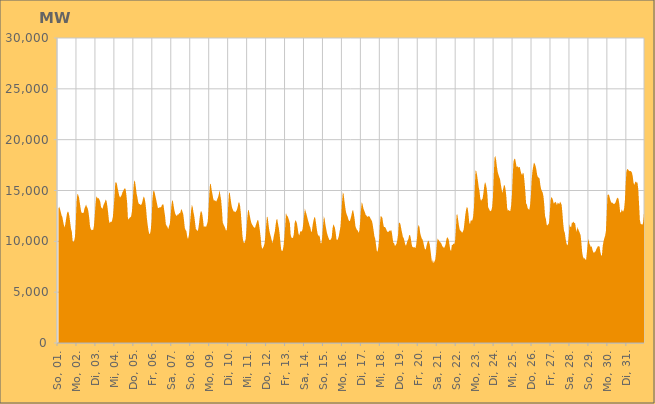
| Category | Series 0 |
|---|---|
|  So, 01.  | 13206.812 |
|  So, 01.  | 13412.942 |
|  So, 01.  | 13187.907 |
|  So, 01.  | 12871.879 |
|  So, 01.  | 12567.019 |
|  So, 01.  | 12397.906 |
|  So, 01.  | 11959.131 |
|  So, 01.  | 11577.426 |
|  So, 01.  | 11364.765 |
|  So, 01.  | 11830.467 |
|  So, 01.  | 12331.606 |
|  So, 01.  | 12767.486 |
|  So, 01.  | 12943.968 |
|  So, 01.  | 12820.488 |
|  So, 01.  | 12429.782 |
|  So, 01.  | 11808.548 |
|  So, 01.  | 11217.723 |
|  Mo, 02.  | 10958.293 |
|  Mo, 02.  | 10046.85 |
|  Mo, 02.  | 9942.97 |
|  Mo, 02.  | 10063.254 |
|  Mo, 02.  | 10441.677 |
|  Mo, 02.  | 11829.314 |
|  Mo, 02.  | 13896.691 |
|  Mo, 02.  | 14652.686 |
|  Mo, 02.  | 14580.764 |
|  Mo, 02.  | 14350.04 |
|  Mo, 02.  | 13843.688 |
|  Mo, 02.  | 13322.694 |
|  Mo, 02.  | 12867.822 |
|  Mo, 02.  | 12779.872 |
|  Mo, 02.  | 12807.514 |
|  Mo, 02.  | 12804.091 |
|  Mo, 02.  | 13235.563 |
|  Mo, 02.  | 13409.297 |
|  Mo, 02.  | 13611.059 |
|  Mo, 02.  | 13400.346 |
|  Mo, 02.  | 13248.885 |
|  Mo, 02.  | 12930.047 |
|  Mo, 02.  | 12322.647 |
|  Mo, 02.  | 11476.606 |
|  Di, 03.  | 11216.047 |
|  Di, 03.  | 11098.079 |
|  Di, 03.  | 11136.207 |
|  Di, 03.  | 11114.453 |
|  Di, 03.  | 11530.686 |
|  Di, 03.  | 12478.214 |
|  Di, 03.  | 13642.537 |
|  Di, 03.  | 14421.271 |
|  Di, 03.  | 14324.255 |
|  Di, 03.  | 14206.972 |
|  Di, 03.  | 14263.212 |
|  Di, 03.  | 14076.895 |
|  Di, 03.  | 13895.04 |
|  Di, 03.  | 13350.521 |
|  Di, 03.  | 13271.455 |
|  Di, 03.  | 13212.365 |
|  Di, 03.  | 13554.942 |
|  Di, 03.  | 13724.392 |
|  Di, 03.  | 13900.76 |
|  Di, 03.  | 14119.902 |
|  Di, 03.  | 13956.413 |
|  Di, 03.  | 13445.582 |
|  Di, 03.  | 12805.064 |
|  Di, 03.  | 12042.712 |
|  Mi, 04.  | 11762.654 |
|  Mi, 04.  | 11934.412 |
|  Mi, 04.  | 11892.97 |
|  Mi, 04.  | 12057.988 |
|  Mi, 04.  | 12428.07 |
|  Mi, 04.  | 13312.577 |
|  Mi, 04.  | 14398.44 |
|  Mi, 04.  | 15741.246 |
|  Mi, 04.  | 15831.863 |
|  Mi, 04.  | 15671.158 |
|  Mi, 04.  | 15222.06 |
|  Mi, 04.  | 14851.032 |
|  Mi, 04.  | 14500.277 |
|  Mi, 04.  | 14307.952 |
|  Mi, 04.  | 14420.647 |
|  Mi, 04.  | 14538.542 |
|  Mi, 04.  | 14801.566 |
|  Mi, 04.  | 14943.229 |
|  Mi, 04.  | 15120.116 |
|  Mi, 04.  | 15221.407 |
|  Mi, 04.  | 15163.406 |
|  Mi, 04.  | 14598.801 |
|  Mi, 04.  | 13806.711 |
|  Mi, 04.  | 12297.38 |
|  Do, 05.  | 12141.491 |
|  Do, 05.  | 12313.181 |
|  Do, 05.  | 12368.373 |
|  Do, 05.  | 12440.057 |
|  Do, 05.  | 12898.041 |
|  Do, 05.  | 13760.099 |
|  Do, 05.  | 15183.152 |
|  Do, 05.  | 16004.259 |
|  Do, 05.  | 15871.261 |
|  Do, 05.  | 15353.351 |
|  Do, 05.  | 14699.198 |
|  Do, 05.  | 14322.082 |
|  Do, 05.  | 13863.061 |
|  Do, 05.  | 13665.603 |
|  Do, 05.  | 13670.417 |
|  Do, 05.  | 13579.349 |
|  Do, 05.  | 13604.6 |
|  Do, 05.  | 13816.485 |
|  Do, 05.  | 14157.835 |
|  Do, 05.  | 14406.164 |
|  Do, 05.  | 14275.221 |
|  Do, 05.  | 13863.005 |
|  Do, 05.  | 13214.484 |
|  Do, 05.  | 12266.777 |
|  Fr, 06.  | 11625.596 |
|  Fr, 06.  | 11079.019 |
|  Fr, 06.  | 10730.204 |
|  Fr, 06.  | 10743.185 |
|  Fr, 06.  | 11172.749 |
|  Fr, 06.  | 12118.175 |
|  Fr, 06.  | 14074.129 |
|  Fr, 06.  | 14894.658 |
|  Fr, 06.  | 15016.659 |
|  Fr, 06.  | 14746.179 |
|  Fr, 06.  | 14354.104 |
|  Fr, 06.  | 14027.11 |
|  Fr, 06.  | 13626.706 |
|  Fr, 06.  | 13277.289 |
|  Fr, 06.  | 13278.358 |
|  Fr, 06.  | 13347.249 |
|  Fr, 06.  | 13361.531 |
|  Fr, 06.  | 13365.29 |
|  Fr, 06.  | 13548.451 |
|  Fr, 06.  | 13647.924 |
|  Fr, 06.  | 13613.515 |
|  Fr, 06.  | 13014.601 |
|  Fr, 06.  | 12491.047 |
|  Fr, 06.  | 11682.633 |
|  Sa, 07.  | 11520.466 |
|  Sa, 07.  | 11438.673 |
|  Sa, 07.  | 11185.14 |
|  Sa, 07.  | 11484.688 |
|  Sa, 07.  | 11713.624 |
|  Sa, 07.  | 12400.79 |
|  Sa, 07.  | 13446.049 |
|  Sa, 07.  | 14038.288 |
|  Sa, 07.  | 13945.266 |
|  Sa, 07.  | 13421.592 |
|  Sa, 07.  | 12986.292 |
|  Sa, 07.  | 12685.922 |
|  Sa, 07.  | 12546.355 |
|  Sa, 07.  | 12504.76 |
|  Sa, 07.  | 12655.341 |
|  Sa, 07.  | 12642.896 |
|  Sa, 07.  | 12801.196 |
|  Sa, 07.  | 12738.394 |
|  Sa, 07.  | 13021.284 |
|  Sa, 07.  | 13174.04 |
|  Sa, 07.  | 12913.663 |
|  Sa, 07.  | 12684.267 |
|  Sa, 07.  | 12057.798 |
|  Sa, 07.  | 11311.35 |
|  So, 08.  | 11118.741 |
|  So, 08.  | 11001.714 |
|  So, 08.  | 10464.286 |
|  So, 08.  | 10224.884 |
|  So, 08.  | 10521.399 |
|  So, 08.  | 11080.018 |
|  So, 08.  | 12144.926 |
|  So, 08.  | 13048.655 |
|  So, 08.  | 13595.226 |
|  So, 08.  | 13363.08 |
|  So, 08.  | 12842.564 |
|  So, 08.  | 12481.511 |
|  So, 08.  | 11842.349 |
|  So, 08.  | 11212.838 |
|  So, 08.  | 11140.497 |
|  So, 08.  | 10992.239 |
|  So, 08.  | 11195.822 |
|  So, 08.  | 11716.869 |
|  So, 08.  | 12424.722 |
|  So, 08.  | 12913.138 |
|  So, 08.  | 12971.084 |
|  So, 08.  | 12720.39 |
|  So, 08.  | 12166.647 |
|  So, 08.  | 11444.404 |
|  Mo, 09.  | 11458.213 |
|  Mo, 09.  | 11462.394 |
|  Mo, 09.  | 11429.864 |
|  Mo, 09.  | 11656.963 |
|  Mo, 09.  | 11947.008 |
|  Mo, 09.  | 13042.342 |
|  Mo, 09.  | 14641.893 |
|  Mo, 09.  | 15672.245 |
|  Mo, 09.  | 15595.711 |
|  Mo, 09.  | 15038.386 |
|  Mo, 09.  | 14645.687 |
|  Mo, 09.  | 14189.676 |
|  Mo, 09.  | 13979.174 |
|  Mo, 09.  | 14067.064 |
|  Mo, 09.  | 13956.225 |
|  Mo, 09.  | 13928.717 |
|  Mo, 09.  | 14140.428 |
|  Mo, 09.  | 14317.686 |
|  Mo, 09.  | 14609.709 |
|  Mo, 09.  | 15028.047 |
|  Mo, 09.  | 14518.894 |
|  Mo, 09.  | 14045.839 |
|  Mo, 09.  | 13153.1 |
|  Mo, 09.  | 11882.105 |
|  Di, 10.  | 11658.072 |
|  Di, 10.  | 11512.674 |
|  Di, 10.  | 11330.217 |
|  Di, 10.  | 11090.632 |
|  Di, 10.  | 11085.22 |
|  Di, 10.  | 11880.764 |
|  Di, 10.  | 13671.089 |
|  Di, 10.  | 14817.556 |
|  Di, 10.  | 14725.402 |
|  Di, 10.  | 14172.264 |
|  Di, 10.  | 13623.232 |
|  Di, 10.  | 13265.014 |
|  Di, 10.  | 13088.367 |
|  Di, 10.  | 12941.091 |
|  Di, 10.  | 12948.157 |
|  Di, 10.  | 12864.173 |
|  Di, 10.  | 12976.701 |
|  Di, 10.  | 13114.904 |
|  Di, 10.  | 13404.971 |
|  Di, 10.  | 13826.029 |
|  Di, 10.  | 13829.934 |
|  Di, 10.  | 13467.711 |
|  Di, 10.  | 12725.259 |
|  Di, 10.  | 11647.776 |
|  Mi, 11.  | 10518.37 |
|  Mi, 11.  | 10001.466 |
|  Mi, 11.  | 9835.466 |
|  Mi, 11.  | 9913.186 |
|  Mi, 11.  | 10233.437 |
|  Mi, 11.  | 11029.984 |
|  Mi, 11.  | 12198.503 |
|  Mi, 11.  | 12996.611 |
|  Mi, 11.  | 13099.688 |
|  Mi, 11.  | 12617.356 |
|  Mi, 11.  | 12215.195 |
|  Mi, 11.  | 11868.638 |
|  Mi, 11.  | 11674.581 |
|  Mi, 11.  | 11559.054 |
|  Mi, 11.  | 11419.342 |
|  Mi, 11.  | 11348.374 |
|  Mi, 11.  | 11344.958 |
|  Mi, 11.  | 11627.68 |
|  Mi, 11.  | 11844.355 |
|  Mi, 11.  | 12090.624 |
|  Mi, 11.  | 12075.187 |
|  Mi, 11.  | 11619.831 |
|  Mi, 11.  | 11073.065 |
|  Mi, 11.  | 10401.215 |
|  Do, 12.  | 9569.502 |
|  Do, 12.  | 9256.662 |
|  Do, 12.  | 9377.084 |
|  Do, 12.  | 9531.637 |
|  Do, 12.  | 9817.061 |
|  Do, 12.  | 10559.014 |
|  Do, 12.  | 11592.8 |
|  Do, 12.  | 12458.223 |
|  Do, 12.  | 12311.707 |
|  Do, 12.  | 11636.108 |
|  Do, 12.  | 11068.572 |
|  Do, 12.  | 10711.188 |
|  Do, 12.  | 10432.554 |
|  Do, 12.  | 10107.21 |
|  Do, 12.  | 9827.13 |
|  Do, 12.  | 10210.492 |
|  Do, 12.  | 10648.504 |
|  Do, 12.  | 10988.287 |
|  Do, 12.  | 11649.358 |
|  Do, 12.  | 12144.068 |
|  Do, 12.  | 12201.657 |
|  Do, 12.  | 11719.605 |
|  Do, 12.  | 11329.065 |
|  Do, 12.  | 10751.145 |
|  Fr, 13.  | 9886.922 |
|  Fr, 13.  | 9191.322 |
|  Fr, 13.  | 9042.491 |
|  Fr, 13.  | 9120.986 |
|  Fr, 13.  | 9580.669 |
|  Fr, 13.  | 10317.091 |
|  Fr, 13.  | 11395.021 |
|  Fr, 13.  | 12795.646 |
|  Fr, 13.  | 12549.989 |
|  Fr, 13.  | 12485.132 |
|  Fr, 13.  | 12303.393 |
|  Fr, 13.  | 12065.793 |
|  Fr, 13.  | 11770.907 |
|  Fr, 13.  | 10650.009 |
|  Fr, 13.  | 10369.388 |
|  Fr, 13.  | 10322.576 |
|  Fr, 13.  | 10360.595 |
|  Fr, 13.  | 10719.299 |
|  Fr, 13.  | 11778.609 |
|  Fr, 13.  | 12096.553 |
|  Fr, 13.  | 11967.86 |
|  Fr, 13.  | 11760.56 |
|  Fr, 13.  | 11223.703 |
|  Fr, 13.  | 10727.778 |
|  Sa, 14.  | 10589.246 |
|  Sa, 14.  | 10953.025 |
|  Sa, 14.  | 10984.891 |
|  Sa, 14.  | 10974.256 |
|  Sa, 14.  | 11161.4 |
|  Sa, 14.  | 11759.121 |
|  Sa, 14.  | 12542.74 |
|  Sa, 14.  | 13210.695 |
|  Sa, 14.  | 12929.413 |
|  Sa, 14.  | 12689.135 |
|  Sa, 14.  | 12370.215 |
|  Sa, 14.  | 12050.265 |
|  Sa, 14.  | 11825.513 |
|  Sa, 14.  | 11513.313 |
|  Sa, 14.  | 11335.348 |
|  Sa, 14.  | 10872.048 |
|  Sa, 14.  | 11084.987 |
|  Sa, 14.  | 11689.085 |
|  Sa, 14.  | 12068.691 |
|  Sa, 14.  | 12383.057 |
|  Sa, 14.  | 12326.23 |
|  Sa, 14.  | 11830.645 |
|  Sa, 14.  | 11255.798 |
|  Sa, 14.  | 10783.027 |
|  So, 15.  | 10548.359 |
|  So, 15.  | 10596.328 |
|  So, 15.  | 10394.109 |
|  So, 15.  | 9806.776 |
|  So, 15.  | 9834.326 |
|  So, 15.  | 10463.024 |
|  So, 15.  | 11537.481 |
|  So, 15.  | 12457.049 |
|  So, 15.  | 12225.374 |
|  So, 15.  | 11637.874 |
|  So, 15.  | 11214.01 |
|  So, 15.  | 10805.121 |
|  So, 15.  | 10548.304 |
|  So, 15.  | 10328.274 |
|  So, 15.  | 10142.63 |
|  So, 15.  | 10119.769 |
|  So, 15.  | 10223.852 |
|  So, 15.  | 10404.218 |
|  So, 15.  | 11250.627 |
|  So, 15.  | 11674.429 |
|  So, 15.  | 11540.199 |
|  So, 15.  | 11324.087 |
|  So, 15.  | 10859.508 |
|  So, 15.  | 10197.895 |
|  Mo, 16.  | 10129.822 |
|  Mo, 16.  | 10270.01 |
|  Mo, 16.  | 10539.384 |
|  Mo, 16.  | 10999.599 |
|  Mo, 16.  | 11432.195 |
|  Mo, 16.  | 12502.461 |
|  Mo, 16.  | 13821.001 |
|  Mo, 16.  | 14801.99 |
|  Mo, 16.  | 14677.072 |
|  Mo, 16.  | 14013.748 |
|  Mo, 16.  | 13411.89 |
|  Mo, 16.  | 12887.51 |
|  Mo, 16.  | 12632.573 |
|  Mo, 16.  | 12447.66 |
|  Mo, 16.  | 12174.016 |
|  Mo, 16.  | 11997.219 |
|  Mo, 16.  | 12017.662 |
|  Mo, 16.  | 12267.702 |
|  Mo, 16.  | 12603.272 |
|  Mo, 16.  | 12995.693 |
|  Mo, 16.  | 13090.275 |
|  Mo, 16.  | 12702.924 |
|  Mo, 16.  | 12172.247 |
|  Mo, 16.  | 11478.896 |
|  Di, 17.  | 11271.365 |
|  Di, 17.  | 11119.419 |
|  Di, 17.  | 11049.117 |
|  Di, 17.  | 10835.407 |
|  Di, 17.  | 11082.682 |
|  Di, 17.  | 11930.505 |
|  Di, 17.  | 13112.479 |
|  Di, 17.  | 13879.634 |
|  Di, 17.  | 13644.893 |
|  Di, 17.  | 13262.925 |
|  Di, 17.  | 13045.188 |
|  Di, 17.  | 12843.783 |
|  Di, 17.  | 12593.17 |
|  Di, 17.  | 12523.73 |
|  Di, 17.  | 12399.173 |
|  Di, 17.  | 12469.278 |
|  Di, 17.  | 12456.297 |
|  Di, 17.  | 12447.59 |
|  Di, 17.  | 12247.717 |
|  Di, 17.  | 12115.099 |
|  Di, 17.  | 11979.906 |
|  Di, 17.  | 11567.25 |
|  Di, 17.  | 11041.217 |
|  Di, 17.  | 10492.672 |
|  Mi, 18.  | 10266.747 |
|  Mi, 18.  | 9686.608 |
|  Mi, 18.  | 9066.852 |
|  Mi, 18.  | 8993.6 |
|  Mi, 18.  | 9455.027 |
|  Mi, 18.  | 10259.98 |
|  Mi, 18.  | 11731.348 |
|  Mi, 18.  | 12522.391 |
|  Mi, 18.  | 12419.21 |
|  Mi, 18.  | 12334.135 |
|  Mi, 18.  | 11795.611 |
|  Mi, 18.  | 11418.521 |
|  Mi, 18.  | 11415.358 |
|  Mi, 18.  | 11349 |
|  Mi, 18.  | 11176.158 |
|  Mi, 18.  | 10980.73 |
|  Mi, 18.  | 10926.917 |
|  Mi, 18.  | 10934.555 |
|  Mi, 18.  | 11081.162 |
|  Mi, 18.  | 10986.49 |
|  Mi, 18.  | 11144.53 |
|  Mi, 18.  | 10911.358 |
|  Mi, 18.  | 10338.517 |
|  Mi, 18.  | 9856.968 |
|  Do, 19.  | 9814.727 |
|  Do, 19.  | 9536.491 |
|  Do, 19.  | 9640.291 |
|  Do, 19.  | 9771.208 |
|  Do, 19.  | 10131.282 |
|  Do, 19.  | 10680.38 |
|  Do, 19.  | 11790.872 |
|  Do, 19.  | 11852.222 |
|  Do, 19.  | 11653.831 |
|  Do, 19.  | 11220.857 |
|  Do, 19.  | 10843.022 |
|  Do, 19.  | 10451.342 |
|  Do, 19.  | 10331.257 |
|  Do, 19.  | 10046.264 |
|  Do, 19.  | 9683.408 |
|  Do, 19.  | 9572.117 |
|  Do, 19.  | 9812.705 |
|  Do, 19.  | 10087.698 |
|  Do, 19.  | 10241.283 |
|  Do, 19.  | 10600.604 |
|  Do, 19.  | 10626.583 |
|  Do, 19.  | 10327.883 |
|  Do, 19.  | 9784.349 |
|  Do, 19.  | 9462.761 |
|  Fr, 20.  | 9434.762 |
|  Fr, 20.  | 9381.134 |
|  Fr, 20.  | 9427.806 |
|  Fr, 20.  | 9337.702 |
|  Fr, 20.  | 9687.365 |
|  Fr, 20.  | 10403.902 |
|  Fr, 20.  | 11338.389 |
|  Fr, 20.  | 11618.835 |
|  Fr, 20.  | 11411.656 |
|  Fr, 20.  | 10794.317 |
|  Fr, 20.  | 10494.035 |
|  Fr, 20.  | 10273.288 |
|  Fr, 20.  | 10162.488 |
|  Fr, 20.  | 9884.414 |
|  Fr, 20.  | 9486.421 |
|  Fr, 20.  | 9218.454 |
|  Fr, 20.  | 9203.803 |
|  Fr, 20.  | 9570.189 |
|  Fr, 20.  | 9860.155 |
|  Fr, 20.  | 10078.753 |
|  Fr, 20.  | 9968.435 |
|  Fr, 20.  | 9710.988 |
|  Fr, 20.  | 9104.445 |
|  Fr, 20.  | 8442.751 |
|  Sa, 21.  | 7902.286 |
|  Sa, 21.  | 8191.226 |
|  Sa, 21.  | 7863.085 |
|  Sa, 21.  | 8015.965 |
|  Sa, 21.  | 8201.836 |
|  Sa, 21.  | 8760.793 |
|  Sa, 21.  | 9681.55 |
|  Sa, 21.  | 10270.259 |
|  Sa, 21.  | 10162.348 |
|  Sa, 21.  | 10057.633 |
|  Sa, 21.  | 9911.605 |
|  Sa, 21.  | 9874.924 |
|  Sa, 21.  | 9731.622 |
|  Sa, 21.  | 9504.176 |
|  Sa, 21.  | 9471.293 |
|  Sa, 21.  | 9325.194 |
|  Sa, 21.  | 9462.991 |
|  Sa, 21.  | 9675.086 |
|  Sa, 21.  | 10127.941 |
|  Sa, 21.  | 10409.775 |
|  Sa, 21.  | 10342.394 |
|  Sa, 21.  | 10171.14 |
|  Sa, 21.  | 9696.755 |
|  Sa, 21.  | 9179.456 |
|  So, 22.  | 9033.905 |
|  So, 22.  | 9632.466 |
|  So, 22.  | 9651.057 |
|  So, 22.  | 9795.601 |
|  So, 22.  | 9712.532 |
|  So, 22.  | 9959.983 |
|  So, 22.  | 11033.26 |
|  So, 22.  | 12607.234 |
|  So, 22.  | 12653.113 |
|  So, 22.  | 12114.782 |
|  So, 22.  | 11539.536 |
|  So, 22.  | 11146.676 |
|  So, 22.  | 11044.655 |
|  So, 22.  | 10971.181 |
|  So, 22.  | 10839.082 |
|  So, 22.  | 10971.558 |
|  So, 22.  | 11171.861 |
|  So, 22.  | 11870.147 |
|  So, 22.  | 12578.658 |
|  So, 22.  | 13100.655 |
|  So, 22.  | 13374.185 |
|  So, 22.  | 13281.186 |
|  So, 22.  | 12732.408 |
|  So, 22.  | 11871.159 |
|  Mo, 23.  | 11680.622 |
|  Mo, 23.  | 12092.487 |
|  Mo, 23.  | 12022.727 |
|  Mo, 23.  | 12083.534 |
|  Mo, 23.  | 12469.003 |
|  Mo, 23.  | 13304.515 |
|  Mo, 23.  | 15237.969 |
|  Mo, 23.  | 16973.159 |
|  Mo, 23.  | 16888.931 |
|  Mo, 23.  | 16472.56 |
|  Mo, 23.  | 15944.536 |
|  Mo, 23.  | 15345.522 |
|  Mo, 23.  | 14938.851 |
|  Mo, 23.  | 14209.202 |
|  Mo, 23.  | 13980.204 |
|  Mo, 23.  | 14118.551 |
|  Mo, 23.  | 14215.535 |
|  Mo, 23.  | 14755.989 |
|  Mo, 23.  | 15431.376 |
|  Mo, 23.  | 15845.528 |
|  Mo, 23.  | 15633.492 |
|  Mo, 23.  | 15266.64 |
|  Mo, 23.  | 14600.336 |
|  Mo, 23.  | 13326.714 |
|  Di, 24.  | 13205.405 |
|  Di, 24.  | 13027.001 |
|  Di, 24.  | 12959.291 |
|  Di, 24.  | 13052.447 |
|  Di, 24.  | 13364.021 |
|  Di, 24.  | 14284.042 |
|  Di, 24.  | 16304.156 |
|  Di, 24.  | 18205.677 |
|  Di, 24.  | 18406.907 |
|  Di, 24.  | 18034.373 |
|  Di, 24.  | 17376.889 |
|  Di, 24.  | 16844.996 |
|  Di, 24.  | 16572.821 |
|  Di, 24.  | 16319.874 |
|  Di, 24.  | 16112.306 |
|  Di, 24.  | 15601.005 |
|  Di, 24.  | 15132.715 |
|  Di, 24.  | 14758.211 |
|  Di, 24.  | 15165.815 |
|  Di, 24.  | 15540.319 |
|  Di, 24.  | 15479.986 |
|  Di, 24.  | 15128 |
|  Di, 24.  | 14408.24 |
|  Di, 24.  | 13296.265 |
|  Mi, 25.  | 12996.334 |
|  Mi, 25.  | 13098.465 |
|  Mi, 25.  | 12998.952 |
|  Mi, 25.  | 12976.67 |
|  Mi, 25.  | 13477.15 |
|  Mi, 25.  | 14502.803 |
|  Mi, 25.  | 16255.299 |
|  Mi, 25.  | 17822.379 |
|  Mi, 25.  | 18091.94 |
|  Mi, 25.  | 18144.948 |
|  Mi, 25.  | 17748.559 |
|  Mi, 25.  | 17298.982 |
|  Mi, 25.  | 17402.123 |
|  Mi, 25.  | 17259.414 |
|  Mi, 25.  | 17316.091 |
|  Mi, 25.  | 17315.838 |
|  Mi, 25.  | 16938.443 |
|  Mi, 25.  | 16647.648 |
|  Mi, 25.  | 16536.413 |
|  Mi, 25.  | 16764.033 |
|  Mi, 25.  | 16629.358 |
|  Mi, 25.  | 15868.306 |
|  Mi, 25.  | 14944.114 |
|  Mi, 25.  | 13727.729 |
|  Do, 26.  | 13624.774 |
|  Do, 26.  | 13248.707 |
|  Do, 26.  | 13170.754 |
|  Do, 26.  | 13106.167 |
|  Do, 26.  | 13515.36 |
|  Do, 26.  | 14448.14 |
|  Do, 26.  | 15971.237 |
|  Do, 26.  | 16875.175 |
|  Do, 26.  | 17366.569 |
|  Do, 26.  | 17755.902 |
|  Do, 26.  | 17624.581 |
|  Do, 26.  | 17411.34 |
|  Do, 26.  | 17051.289 |
|  Do, 26.  | 16531.017 |
|  Do, 26.  | 16311.391 |
|  Do, 26.  | 16263.733 |
|  Do, 26.  | 16185.893 |
|  Do, 26.  | 15550.225 |
|  Do, 26.  | 15153.721 |
|  Do, 26.  | 14940.577 |
|  Do, 26.  | 14779.323 |
|  Do, 26.  | 14423.537 |
|  Do, 26.  | 13595.265 |
|  Do, 26.  | 12481.008 |
|  Fr, 27.  | 12214.744 |
|  Fr, 27.  | 11659 |
|  Fr, 27.  | 11561.045 |
|  Fr, 27.  | 11673.724 |
|  Fr, 27.  | 11798.617 |
|  Fr, 27.  | 12782.74 |
|  Fr, 27.  | 14027.284 |
|  Fr, 27.  | 14363.111 |
|  Fr, 27.  | 14247.654 |
|  Fr, 27.  | 14071.139 |
|  Fr, 27.  | 13710.568 |
|  Fr, 27.  | 13800.931 |
|  Fr, 27.  | 13892.097 |
|  Fr, 27.  | 13800.25 |
|  Fr, 27.  | 13554.649 |
|  Fr, 27.  | 13813.609 |
|  Fr, 27.  | 13728.44 |
|  Fr, 27.  | 13658.308 |
|  Fr, 27.  | 13909.458 |
|  Fr, 27.  | 13769.672 |
|  Fr, 27.  | 13589.861 |
|  Fr, 27.  | 12750.349 |
|  Fr, 27.  | 11721.751 |
|  Fr, 27.  | 11034.8 |
|  Sa, 28.  | 10855.721 |
|  Sa, 28.  | 10259.62 |
|  Sa, 28.  | 9823.876 |
|  Sa, 28.  | 9604.17 |
|  Sa, 28.  | 9737.485 |
|  Sa, 28.  | 10595.327 |
|  Sa, 28.  | 11670.404 |
|  Sa, 28.  | 11447.354 |
|  Sa, 28.  | 11375.003 |
|  Sa, 28.  | 11841.871 |
|  Sa, 28.  | 11819.43 |
|  Sa, 28.  | 11949.684 |
|  Sa, 28.  | 11798.216 |
|  Sa, 28.  | 11786.715 |
|  Sa, 28.  | 11275.932 |
|  Sa, 28.  | 10934.498 |
|  Sa, 28.  | 11418.698 |
|  Sa, 28.  | 11185.463 |
|  Sa, 28.  | 11014.468 |
|  Sa, 28.  | 10805.684 |
|  Sa, 28.  | 10598.803 |
|  Sa, 28.  | 9835.198 |
|  Sa, 28.  | 8897.043 |
|  Sa, 28.  | 8489.619 |
|  So, 29.  | 8313.737 |
|  So, 29.  | 8348.822 |
|  So, 29.  | 8195.655 |
|  So, 29.  | 8210.712 |
|  So, 29.  | 8961.348 |
|  So, 29.  | 9789.396 |
|  So, 29.  | 10247.28 |
|  So, 29.  | 9815.115 |
|  So, 29.  | 9620.616 |
|  So, 29.  | 9449.024 |
|  So, 29.  | 9516.252 |
|  So, 29.  | 9164.928 |
|  So, 29.  | 8935.689 |
|  So, 29.  | 8854.523 |
|  So, 29.  | 8969.637 |
|  So, 29.  | 9026.527 |
|  So, 29.  | 9261.085 |
|  So, 29.  | 9378.122 |
|  So, 29.  | 9527.053 |
|  So, 29.  | 9526.186 |
|  So, 29.  | 9480.419 |
|  So, 29.  | 8966.502 |
|  So, 29.  | 8602.212 |
|  Mo, 30.  | 8630.415 |
|  Mo, 30.  | 9549.802 |
|  Mo, 30.  | 9984.711 |
|  Mo, 30.  | 10302.152 |
|  Mo, 30.  | 10529.589 |
|  Mo, 30.  | 10999.774 |
|  Mo, 30.  | 12600.268 |
|  Mo, 30.  | 14546.687 |
|  Mo, 30.  | 14612.243 |
|  Mo, 30.  | 14569.301 |
|  Mo, 30.  | 14246.804 |
|  Mo, 30.  | 13975.922 |
|  Mo, 30.  | 13790.869 |
|  Mo, 30.  | 13830.3 |
|  Mo, 30.  | 13718.794 |
|  Mo, 30.  | 13681.312 |
|  Mo, 30.  | 13698.907 |
|  Mo, 30.  | 13790.643 |
|  Mo, 30.  | 14038.945 |
|  Mo, 30.  | 14226.17 |
|  Mo, 30.  | 14308.211 |
|  Mo, 30.  | 14161.797 |
|  Mo, 30.  | 13687.31 |
|  Mo, 30.  | 12884.077 |
|  Di, 31.  | 12822.463 |
|  Di, 31.  | 13148.075 |
|  Di, 31.  | 12975.944 |
|  Di, 31.  | 12939.58 |
|  Di, 31.  | 13197.125 |
|  Di, 31.  | 13972.139 |
|  Di, 31.  | 15531.015 |
|  Di, 31.  | 16902.178 |
|  Di, 31.  | 17113.094 |
|  Di, 31.  | 17071.165 |
|  Di, 31.  | 16955.292 |
|  Di, 31.  | 16902.329 |
|  Di, 31.  | 16920.35 |
|  Di, 31.  | 16876.407 |
|  Di, 31.  | 16744.063 |
|  Di, 31.  | 16388.016 |
|  Di, 31.  | 15764.878 |
|  Di, 31.  | 15545.393 |
|  Di, 31.  | 15822.369 |
|  Di, 31.  | 15878.517 |
|  Di, 31.  | 15769.518 |
|  Di, 31.  | 15788.715 |
|  Di, 31.  | 15101.752 |
|  Di, 31.  | 13637.264 |
|  Mi, 01.  | 12103.252 |
|  Mi, 01.  | 11728.366 |
|  Mi, 01.  | 11682.984 |
|  Mi, 01.  | 11630.048 |
|  Mi, 01.  | 11784.051 |
|  Mi, 01.  | 12527.218 |
|    | 14091.157 |